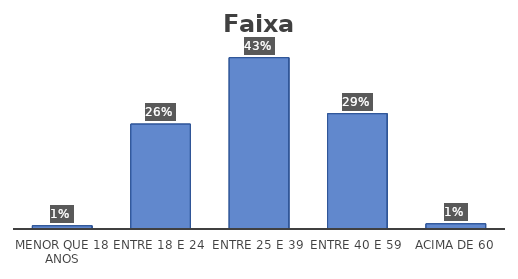
| Category | Series 0 |
|---|---|
| Menor que 18 anos | 0.008 |
| Entre 18 e 24 | 0.262 |
| Entre 25 e 39 | 0.428 |
| Entre 40 e 59 | 0.288 |
| Acima de 60 | 0.013 |